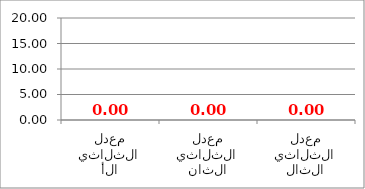
| Category | Series 0 |
|---|---|
| معدل الثلاثي الأول | 0 |
| معدل الثلاثي الثاني | 0 |
| معدل الثلاثي الثالث | 0 |